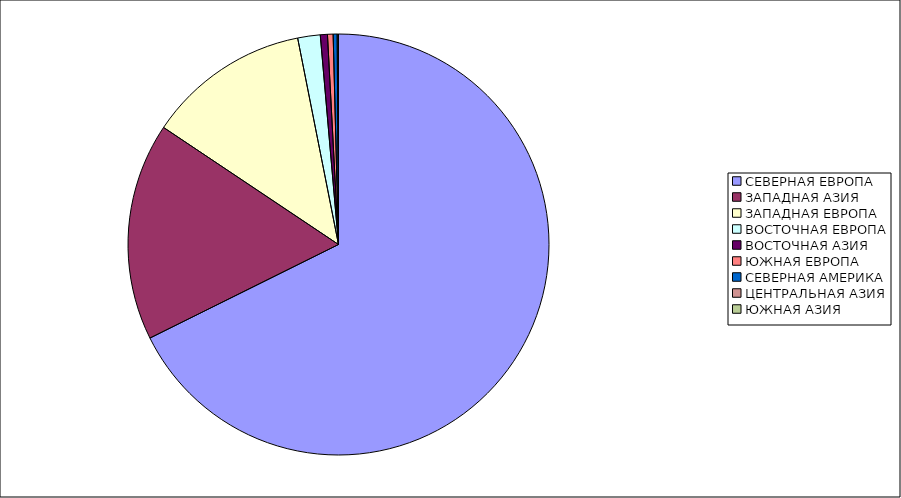
| Category | Оборот |
|---|---|
| СЕВЕРНАЯ ЕВРОПА | 67.667 |
| ЗАПАДНАЯ АЗИЯ | 16.718 |
| ЗАПАДНАЯ ЕВРОПА | 12.505 |
| ВОСТОЧНАЯ ЕВРОПА | 1.727 |
| ВОСТОЧНАЯ АЗИЯ | 0.547 |
| ЮЖНАЯ ЕВРОПА | 0.43 |
| СЕВЕРНАЯ АМЕРИКА | 0.307 |
| ЦЕНТРАЛЬНАЯ АЗИЯ | 0.099 |
| ЮЖНАЯ АЗИЯ | 0 |